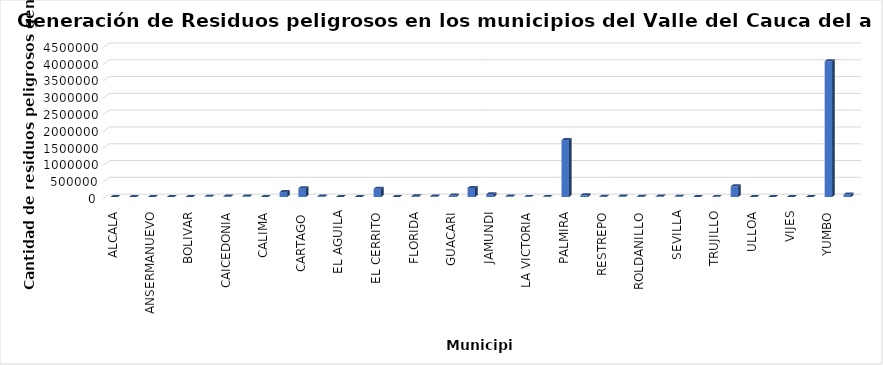
| Category | Series 0 |
|---|---|
| ALCALA | 2058.85 |
| ANDALUCIA | 2732.15 |
| ANSERMANUEVO | 2528 |
| ARGELIA | 1414 |
| BOLIVAR | 2101.27 |
| BUGALAGRANDE | 11591.1 |
| CAICEDONIA | 14392 |
| CALI | 17981.3 |
| CALIMA | 67 |
| CANDELARIA | 146504.51 |
| CARTAGO | 263125.07 |
| DAGUA | 13255.54 |
| EL AGUILA | 1065 |
| EL CAIRO | 1349.2 |
| EL CERRITO | 247269.62 |
| EL DOVIO | 1597 |
| FLORIDA | 21366.8 |
| GINEBRA | 15961.5 |
| GUACARI | 42579.6 |
| GUADALAJARA DE BUGA | 269782.67 |
| JAMUNDI | 84277.8 |
| LA UNION | 12247.41 |
| LA VICTORIA | 2970.9 |
| OBANDO | 3801.6 |
| PALMIRA | 1694457.28 |
| PRADERA | 51078.73 |
| RESTREPO | 8230 |
| RIOFRIO | 12739 |
| ROLDANILLO | 9681 |
| SAN PEDRO | 12443.12 |
| SEVILLA | 11131 |
| TORO | 239.9 |
| TRUJILLO | 4070.75 |
| TULUA | 318921.96 |
| ULLOA | 632.56 |
| VERSALLES | 1784.85 |
| VIJES | 1465.5 |
| YOTOCO | 987.03 |
| YUMBO | 4042027.73 |
| ZARZAL | 72891.5 |